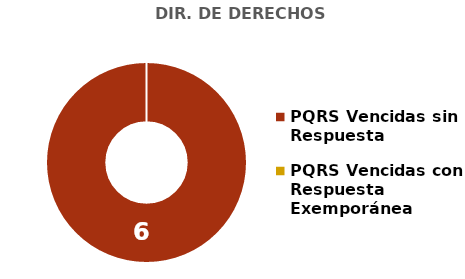
| Category | DIR. DE DERECHOS HUMANOS |
|---|---|
| PQRS Vencidas sin Respuesta | 6 |
| PQRS Vencidas con Respuesta Exemporánea | 0 |